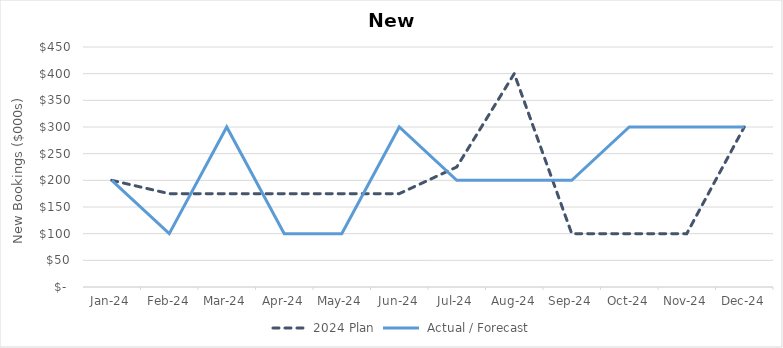
| Category | 2024 Plan |  Actual / Forecast |
|---|---|---|
| 2024-01-31 | 200 | 200 |
| 2024-02-29 | 175 | 100 |
| 2024-03-31 | 175 | 300 |
| 2024-04-30 | 175 | 100 |
| 2024-05-31 | 175 | 100 |
| 2024-06-30 | 175 | 300 |
| 2024-07-31 | 225 | 200 |
| 2024-08-31 | 400 | 200 |
| 2024-09-30 | 100 | 200 |
| 2024-10-31 | 100 | 300 |
| 2024-11-30 | 100 | 300 |
| 2024-12-31 | 300 | 300 |